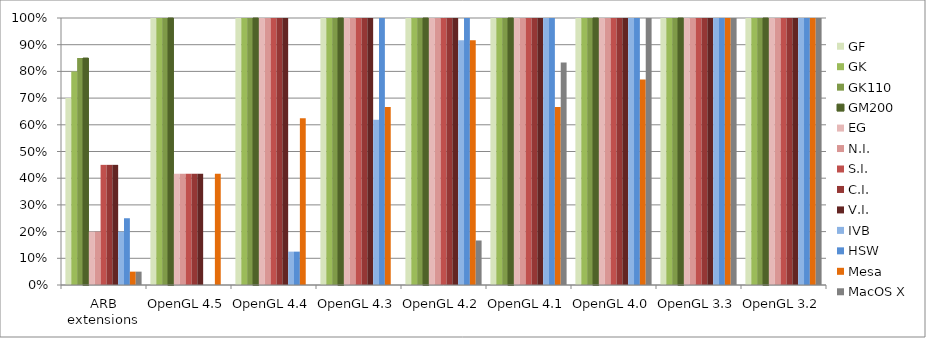
| Category | GF | GK | GK110 | GM200 | EG | N.I. | S.I. | C.I. | V.I. | IVB | HSW | Mesa | MacOS X |
|---|---|---|---|---|---|---|---|---|---|---|---|---|---|
| ARB extensions | 0.7 | 0.8 | 0.85 | 0.85 | 0.2 | 0.2 | 0.45 | 0.45 | 0.45 | 0.2 | 0.25 | 0.05 | 0.05 |
| OpenGL 4.5 | 1 | 1 | 1 | 1 | 0.417 | 0.417 | 0.417 | 0.417 | 0.417 | 0 | 0 | 0.417 | 0 |
| OpenGL 4.4 | 1 | 1 | 1 | 1 | 1 | 1 | 1 | 1 | 1 | 0.125 | 0.125 | 0.625 | 0 |
| OpenGL 4.3 | 1 | 1 | 1 | 1 | 1 | 1 | 1 | 1 | 1 | 0.619 | 1 | 0.667 | 0 |
| OpenGL 4.2 | 1 | 1 | 1 | 1 | 1 | 1 | 1 | 1 | 1 | 0.917 | 1 | 0.917 | 0.167 |
| OpenGL 4.1 | 1 | 1 | 1 | 1 | 1 | 1 | 1 | 1 | 1 | 1 | 1 | 0.667 | 0.833 |
| OpenGL 4.0 | 1 | 1 | 1 | 1 | 1 | 1 | 1 | 1 | 1 | 1 | 1 | 0.769 | 1 |
| OpenGL 3.3 | 1 | 1 | 1 | 1 | 1 | 1 | 1 | 1 | 1 | 1 | 1 | 1 | 1 |
| OpenGL 3.2 | 1 | 1 | 1 | 1 | 1 | 1 | 1 | 1 | 1 | 1 | 1 | 1 | 1 |